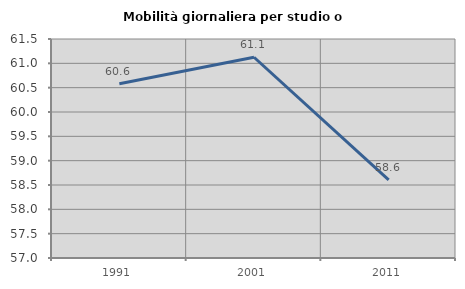
| Category | Mobilità giornaliera per studio o lavoro |
|---|---|
| 1991.0 | 60.581 |
| 2001.0 | 61.125 |
| 2011.0 | 58.605 |